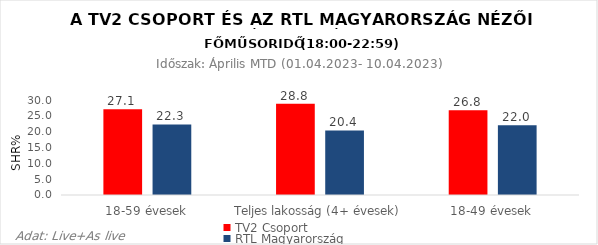
| Category | TV2 Csoport | RTL Magyarország |
|---|---|---|
| 18-59 évesek | 27.1 | 22.3 |
| Teljes lakosság (4+ évesek) | 28.8 | 20.4 |
| 18-49 évesek | 26.8 | 22 |